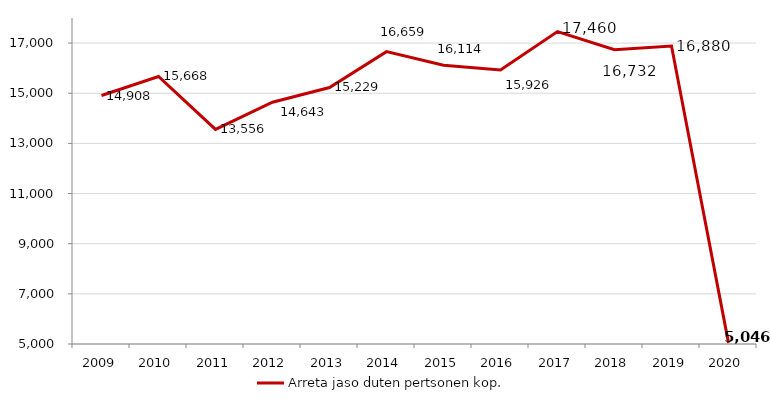
| Category | Arreta jaso duten pertsonen kop. |
|---|---|
| 2009.0 | 14908 |
| 2010.0 | 15668 |
| 2011.0 | 13556 |
| 2012.0 | 14643 |
| 2013.0 | 15229 |
| 2014.0 | 16659 |
| 2015.0 | 16114 |
| 2016.0 | 15926 |
| 2017.0 | 17460 |
| 2018.0 | 16732 |
| 2019.0 | 16880 |
| 2020.0 | 5046 |